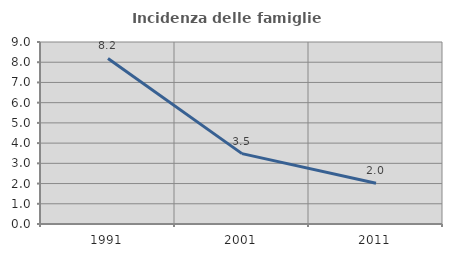
| Category | Incidenza delle famiglie numerose |
|---|---|
| 1991.0 | 8.187 |
| 2001.0 | 3.48 |
| 2011.0 | 2.011 |